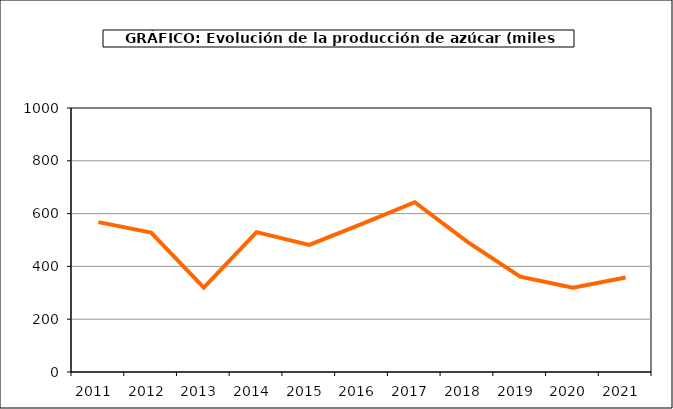
| Category | Producción |
|---|---|
| 2011.0 | 567.722 |
| 2012.0 | 528.414 |
| 2013.0 | 319.237 |
| 2014.0 | 529.794 |
| 2015.0 | 481.569 |
| 2016.0 | 560.897 |
| 2017.0 | 642.971 |
| 2018.0 | 493.179 |
| 2019.0 | 361.224 |
| 2020.0 | 319.147 |
| 2021.0 | 357.838 |